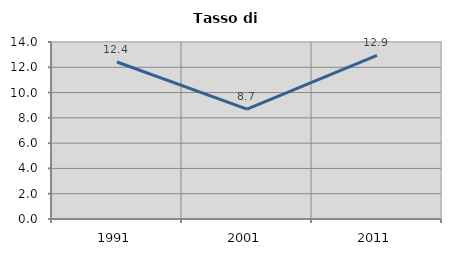
| Category | Tasso di disoccupazione   |
|---|---|
| 1991.0 | 12.418 |
| 2001.0 | 8.696 |
| 2011.0 | 12.95 |